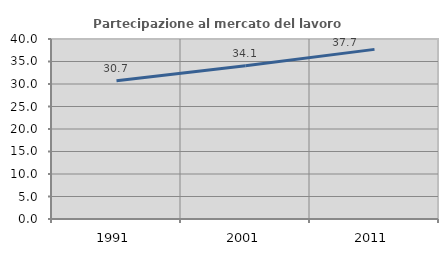
| Category | Partecipazione al mercato del lavoro  femminile |
|---|---|
| 1991.0 | 30.743 |
| 2001.0 | 34.072 |
| 2011.0 | 37.696 |